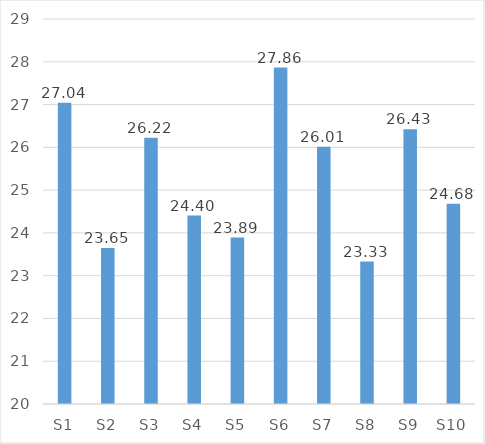
| Category | Mean |
|---|---|
| S1 | 27.042 |
| S2 | 23.647 |
| S3 | 26.224 |
| S4 | 24.404 |
| S5 | 23.892 |
| S6 | 27.864 |
| S7 | 26.011 |
| S8 | 23.329 |
| S9 | 26.425 |
| S10 | 24.679 |